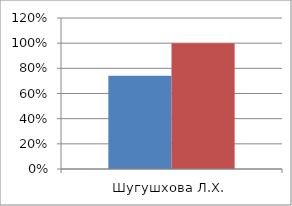
| Category | Series 0 | 2 |
|---|---|---|
| Шугушхова Л.Х. | 0.742 | 1 |